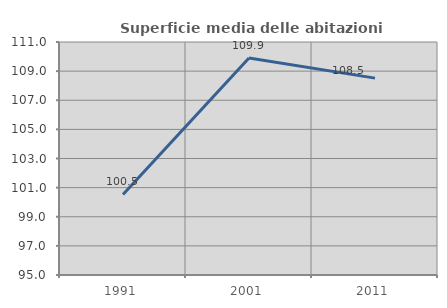
| Category | Superficie media delle abitazioni occupate |
|---|---|
| 1991.0 | 100.533 |
| 2001.0 | 109.906 |
| 2011.0 | 108.521 |